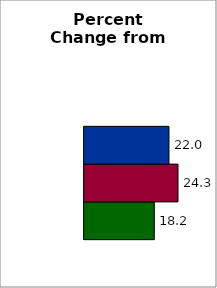
| Category | 50 states and D.C. | SREB states | State |
|---|---|---|---|
| 0 | 18.163 | 24.302 | 21.96 |